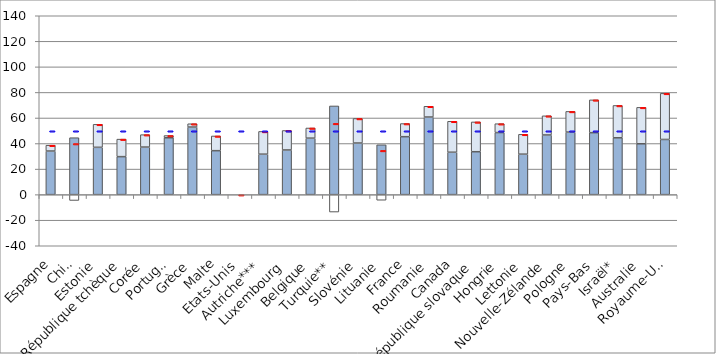
| Category | Revenus brut | Impôts nets | Transferts nets |
|---|---|---|---|
| Espagne | 34.12 | 0 | 4.569 |
| Chili | 44.569 | -4.574 | 0 |
| Estonie | 37.031 | 0 | 18.019 |
| République tchèque | 29.739 | 0 | 13.708 |
| Corée | 37.229 | 0 | 9.714 |
| Portugal | 44.527 | 0 | 1.73 |
| Grèce | 52.895 | 0 | 2.584 |
| Malte | 34.421 | 0 | 11.497 |
| Etats-Unis | 0 | 0 | 0 |
| Autriche*** | 31.671 | 0 | 17.811 |
| Luxembourg | 34.967 | 0 | 15.238 |
| Belgique | 44.209 | 0 | 7.954 |
| Turquie** | 69.411 | -13.629 | 0 |
| Slovénie | 40.389 | 0 | 19.225 |
| Lituanie | 39.006 | -4.386 | 0 |
| France | 45.36 | 0 | 10.285 |
| Roumanie | 60.739 | 0 | 8.428 |
| Canada | 33.197 | 0 | 24.217 |
| République slovaque | 33.595 | 0 | 23.324 |
| Hongrie | 48.586 | 0 | 6.94 |
| Lettonie | 31.676 | 0 | 15.539 |
| Nouvelle-Zélande | 46.687 | 0 | 15.003 |
| Pologne | 48.953 | 0 | 16.187 |
| Pays-Bas | 48.493 | 0 | 25.691 |
| Israël* | 44.494 | 0 | 25.315 |
| Australie | 39.811 | 0 | 28.5 |
| Royaume-Uni | 43.18 | 0 | 36.105 |